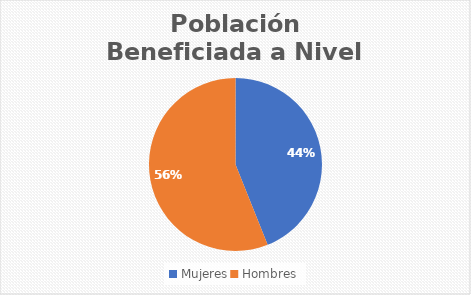
| Category | Series 0 |
|---|---|
| Mujeres | 330 |
| Hombres | 421 |